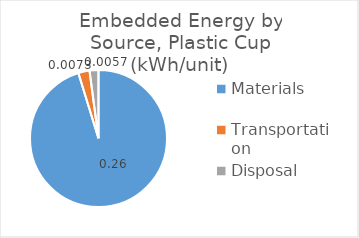
| Category | Series 0 |
|---|---|
| Materials | 0.26 |
| Transportation | 0.007 |
| Disposal | 0.006 |